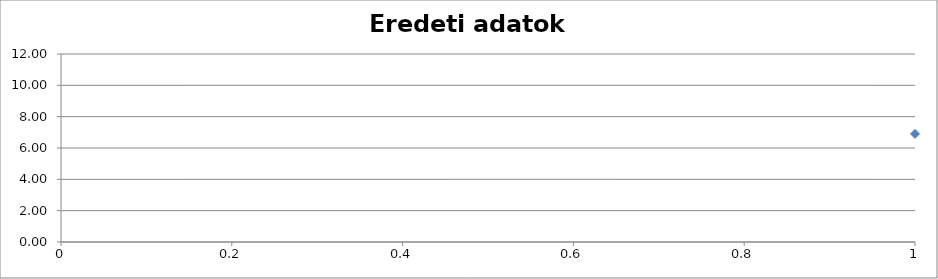
| Category | Series 0 |
|---|---|
| 0 | 6.9 |
| 1 | 9.65 |
| 2 | 6.75 |
| 3 | 6 |
| 4 | 5.45 |
| 5 | 7.8 |
| 6 | 6.55 |
| 7 | 8.55 |
| 8 | 3.5 |
| 9 | 2.65 |
| 10 | 8.15 |
| 11 | 9.3 |
| 12 | 4.3 |
| 13 | 3.75 |
| 14 | 5.35 |
| 15 | 9.95 |
| 16 | 7.75 |
| 17 | 3.1 |
| 18 | 8.25 |
| 19 | 9.25 |
| 20 | 7.2 |
| 21 | 3 |
| 22 | 4 |
| 23 | 8 |
| 24 | 3.8 |
| 25 | 7.4 |
| 26 | 8.25 |
| 27 | 6.45 |
| 28 | 5.7 |
| 29 | 8.25 |
| 30 | 6.35 |
| 31 | 3 |
| 32 | 7.7 |
| 33 | 8.1 |
| 34 | 9 |
| 35 | 8.15 |
| 36 | 6.9 |
| 37 | 4.35 |
| 38 | 5.65 |
| 39 | 5.5 |
| 40 | 3.85 |
| 41 | 9.45 |
| 42 | 6.5 |
| 43 | 6.9 |
| 44 | 6.1 |
| 45 | 8.4 |
| 46 | 5.85 |
| 47 | 7.05 |
| 48 | 6.6 |
| 49 | 8.05 |
| 50 | 8.55 |
| 51 | 3.55 |
| 52 | 7.95 |
| 53 | 7.1 |
| 54 | 10 |
| 55 | 7.15 |
| 56 | 2.95 |
| 57 | 5 |
| 58 | 3.25 |
| 59 | 9.7 |
| 60 | 9.6 |
| 61 | 5.65 |
| 62 | 9.75 |
| 63 | 9.45 |
| 64 | 7.55 |
| 65 | 5.2 |
| 66 | 9 |
| 67 | 8.05 |
| 68 | 5.3 |
| 69 | 6.85 |
| 70 | 7.05 |
| 71 | 7.05 |
| 72 | 3.75 |
| 73 | 8.55 |
| 74 | 3 |
| 75 | 8.1 |
| 76 | 2.6 |
| 77 | 5.5 |
| 78 | 6.05 |
| 79 | 5.55 |
| 80 | 8.7 |
| 81 | 5.35 |
| 82 | 6.55 |
| 83 | 3.5 |
| 84 | 4.1 |
| 85 | 7.8 |
| 86 | 5.35 |
| 87 | 9.05 |
| 88 | 4.5 |
| 89 | 7.75 |
| 90 | 6.9 |
| 91 | 4.3 |
| 92 | 3.25 |
| 93 | 6.8 |
| 94 | 9.3 |
| 95 | 8.1 |
| 96 | 5 |
| 97 | 9.7 |
| 98 | 3.9 |
| 99 | 4.05 |
| 100 | 2.9 |
| 101 | 7.85 |
| 102 | 6.1 |
| 103 | 6.5 |
| 104 | 6.25 |
| 105 | 7.15 |
| 106 | 6.8 |
| 107 | 8.8 |
| 108 | 6 |
| 109 | 6 |
| 110 | 5.4 |
| 111 | 9.05 |
| 112 | 3.7 |
| 113 | 3.7 |
| 114 | 2.5 |
| 115 | 7.75 |
| 116 | 9.35 |
| 117 | 2.5 |
| 118 | 4.75 |
| 119 | 4.05 |
| 120 | 5.9 |
| 121 | 8.8 |
| 122 | 5 |
| 123 | 9.5 |
| 124 | 9.9 |
| 125 | 7.6 |
| 126 | 3.55 |
| 127 | 2 |
| 128 | 7.2 |
| 129 | 6.35 |
| 130 | 9.7 |
| 131 | 7.9 |
| 132 | 6.7 |
| 133 | 8.85 |
| 134 | 2.95 |
| 135 | 8.45 |
| 136 | 7.1 |
| 137 | 8.3 |
| 138 | 6 |
| 139 | 5.4 |
| 140 | 3.3 |
| 141 | 2.6 |
| 142 | 2.5 |
| 143 | 5.65 |
| 144 | 9.35 |
| 145 | 7.8 |
| 146 | 3 |
| 147 | 6.1 |
| 148 | 9.8 |